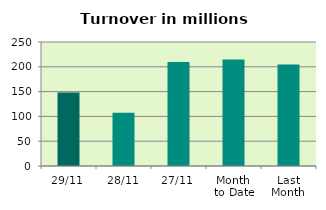
| Category | Series 0 |
|---|---|
| 29/11 | 148.405 |
| 28/11 | 107.244 |
| 27/11 | 209.832 |
| Month 
to Date | 214.794 |
| Last
Month | 204.729 |